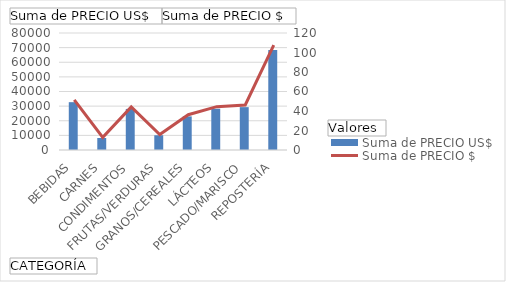
| Category | Suma de PRECIO US$ |
|---|---|
| BEBIDAS | 49.05 |
| CARNES | 12.33 |
| CONDIMENTOS | 42.13 |
| FRUTAS/VERDURAS | 15.12 |
| GRANOS/CEREALES | 34.47 |
| LÁCTEOS | 42.33 |
| PESCADO/MARISCO | 43.96 |
| REPOSTERÍA | 102.52 |